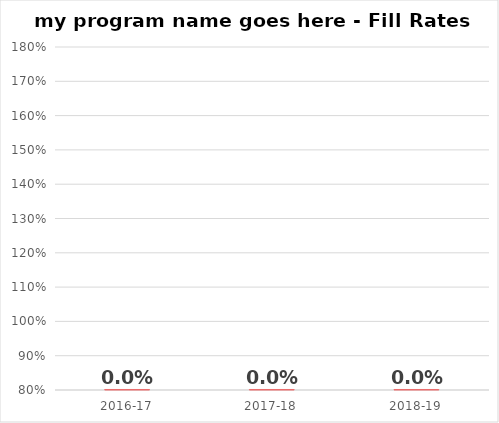
| Category | Fill |
|---|---|
| 2016-17 | 0 |
| 2017-18 | 0 |
| 2018-19 | 0 |